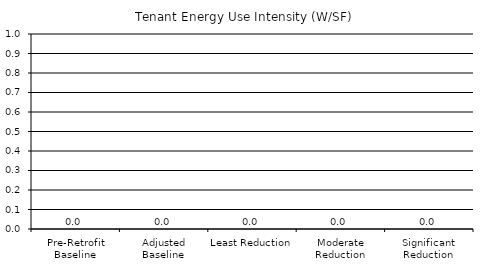
| Category | Series 0 |
|---|---|
| Pre-Retrofit Baseline | 0 |
| Adjusted Baseline | 0 |
| Least Reduction | 0 |
| Moderate Reduction | 0 |
| Significant Reduction | 0 |